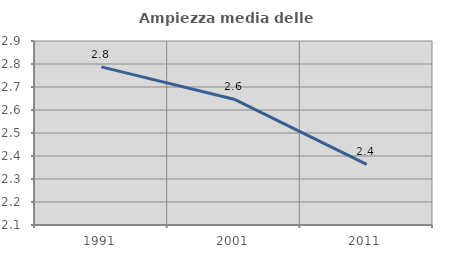
| Category | Ampiezza media delle famiglie |
|---|---|
| 1991.0 | 2.788 |
| 2001.0 | 2.647 |
| 2011.0 | 2.364 |